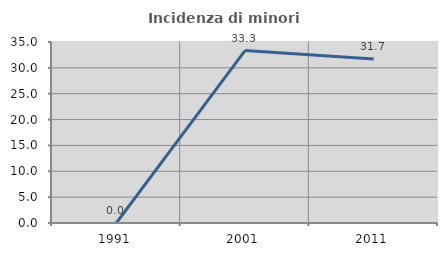
| Category | Incidenza di minori stranieri |
|---|---|
| 1991.0 | 0 |
| 2001.0 | 33.333 |
| 2011.0 | 31.731 |